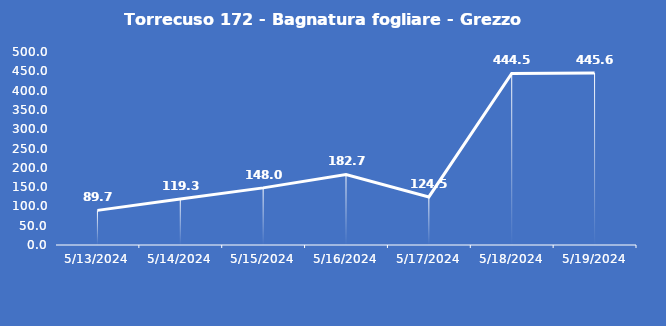
| Category | Torrecuso 172 - Bagnatura fogliare - Grezzo (min) |
|---|---|
| 5/13/24 | 89.7 |
| 5/14/24 | 119.3 |
| 5/15/24 | 148 |
| 5/16/24 | 182.7 |
| 5/17/24 | 124.5 |
| 5/18/24 | 444.5 |
| 5/19/24 | 445.6 |